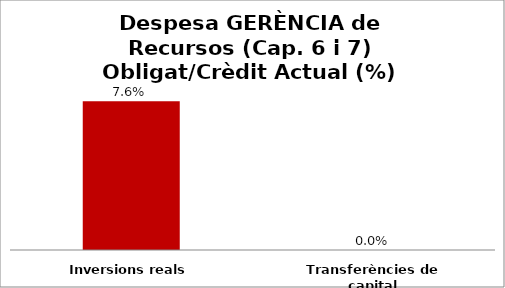
| Category | Series 0 |
|---|---|
| Inversions reals | 0.076 |
| Transferències de capital | 0 |